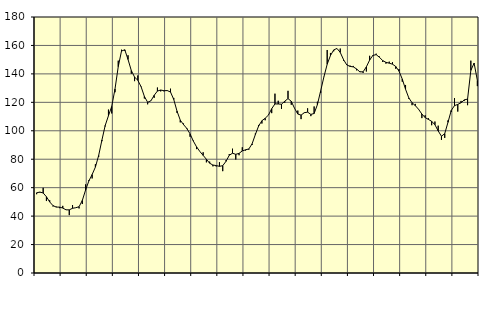
| Category | Piggar | Series 1 |
|---|---|---|
| nan | 55.4 | 56.39 |
| 87.0 | 56.6 | 56.91 |
| 87.0 | 59.9 | 56.26 |
| 87.0 | 50.6 | 53.62 |
| nan | 51.1 | 49.95 |
| 88.0 | 46.8 | 47.41 |
| 88.0 | 46.7 | 46.33 |
| 88.0 | 45.6 | 46.34 |
| nan | 47.2 | 45.67 |
| 89.0 | 44.5 | 44.42 |
| 89.0 | 40.7 | 44.4 |
| 89.0 | 47.8 | 45.5 |
| nan | 45.9 | 45.91 |
| 90.0 | 45.4 | 46.6 |
| 90.0 | 48.5 | 51.06 |
| 90.0 | 62.3 | 58.38 |
| nan | 65.3 | 64.73 |
| 91.0 | 66.5 | 69.23 |
| 91.0 | 76.5 | 74.47 |
| 91.0 | 81.6 | 82.65 |
| nan | 92.7 | 93.49 |
| 92.0 | 103.1 | 103.71 |
| 92.0 | 114.9 | 110.58 |
| 92.0 | 112.2 | 117.12 |
| nan | 127.1 | 129.34 |
| 93.0 | 149.3 | 145.12 |
| 93.0 | 157 | 156.05 |
| 93.0 | 156.2 | 156.95 |
| nan | 153.1 | 150.15 |
| 94.0 | 140.1 | 142.36 |
| 94.0 | 134.9 | 137.77 |
| 94.0 | 138.9 | 135.47 |
| nan | 131.2 | 130.95 |
| 95.0 | 122.7 | 124.18 |
| 95.0 | 118.6 | 120.04 |
| 95.0 | 121.2 | 121.05 |
| nan | 123.2 | 124.92 |
| 96.0 | 130.4 | 127.93 |
| 96.0 | 127.7 | 128.65 |
| 96.0 | 127.7 | 128.18 |
| nan | 128.5 | 128.27 |
| 97.0 | 129.6 | 127.27 |
| 97.0 | 123.1 | 122.01 |
| 97.0 | 112.6 | 113.82 |
| nan | 105.9 | 107.49 |
| 98.0 | 105.1 | 104.32 |
| 98.0 | 101.2 | 101.66 |
| 98.0 | 95.8 | 97.81 |
| nan | 93.1 | 92.74 |
| 99.0 | 87.1 | 88.65 |
| 99.0 | 85.4 | 85.44 |
| 99.0 | 84.9 | 82.71 |
| nan | 77.8 | 79.97 |
| 0.0 | 78.3 | 77.17 |
| 0.0 | 75 | 75.92 |
| 0.0 | 74.9 | 75.54 |
| nan | 77.9 | 75.01 |
| 1.0 | 71.6 | 75.46 |
| 1.0 | 79.3 | 78.49 |
| 1.0 | 83.6 | 82.79 |
| nan | 87.4 | 84.22 |
| 2.0 | 79.8 | 83.45 |
| 2.0 | 82.8 | 84.12 |
| 2.0 | 88.4 | 85.82 |
| nan | 86.1 | 86.63 |
| 3.0 | 86.7 | 87.21 |
| 3.0 | 90 | 90.83 |
| 3.0 | 98.1 | 97.35 |
| nan | 104.1 | 103.37 |
| 4.0 | 105.1 | 107.06 |
| 4.0 | 107.4 | 108.79 |
| 4.0 | 111.2 | 111.02 |
| nan | 112.4 | 115.52 |
| 5.0 | 126.1 | 118.89 |
| 5.0 | 121.1 | 118.83 |
| 5.0 | 115.4 | 118.69 |
| nan | 119.7 | 120.77 |
| 6.0 | 128.1 | 122.64 |
| 6.0 | 118.3 | 120.72 |
| 6.0 | 115.7 | 115.81 |
| nan | 114.2 | 111.76 |
| 7.0 | 108.2 | 111.02 |
| 7.0 | 112.5 | 112.71 |
| 7.0 | 115.8 | 113.11 |
| nan | 110.3 | 111.52 |
| 8.0 | 117.1 | 112.15 |
| 8.0 | 120.4 | 118.35 |
| 8.0 | 126.6 | 128.09 |
| nan | 137.8 | 137.94 |
| 9.0 | 156.8 | 146.8 |
| 9.0 | 154.7 | 152.89 |
| 9.0 | 155.9 | 156.86 |
| nan | 157.9 | 157.88 |
| 10.0 | 157.8 | 155.08 |
| 10.0 | 149.3 | 150.07 |
| 10.0 | 146.7 | 146.31 |
| nan | 145.8 | 145.27 |
| 11.0 | 145.6 | 144.92 |
| 11.0 | 142.5 | 143.49 |
| 11.0 | 141.9 | 141.43 |
| nan | 140.7 | 141.47 |
| 12.0 | 141.7 | 144.96 |
| 12.0 | 152.7 | 149.71 |
| 12.0 | 152.6 | 153.01 |
| nan | 154.2 | 153.52 |
| 13.0 | 152.2 | 151.69 |
| 13.0 | 148.4 | 149.34 |
| 13.0 | 147.2 | 148.12 |
| nan | 148.6 | 147.53 |
| 14.0 | 148.2 | 146.83 |
| 14.0 | 143.6 | 145.2 |
| 14.0 | 143.4 | 141.92 |
| nan | 134.5 | 136.36 |
| 15.0 | 132.2 | 129.21 |
| 15.0 | 122.5 | 123.13 |
| 15.0 | 118 | 119.7 |
| nan | 118.9 | 117.68 |
| 16.0 | 115.2 | 115.06 |
| 16.0 | 108.9 | 111.77 |
| 16.0 | 110.9 | 109.29 |
| nan | 108.8 | 107.99 |
| 17.0 | 103.9 | 106.67 |
| 17.0 | 106.5 | 104.24 |
| 17.0 | 103.6 | 99.88 |
| nan | 93.6 | 96.16 |
| 18.0 | 95 | 97.99 |
| 18.0 | 107.3 | 105.97 |
| 18.0 | 113.2 | 114.31 |
| nan | 123 | 117.69 |
| 19.0 | 113.5 | 118.56 |
| 19.0 | 121 | 119.7 |
| 19.0 | 121.1 | 121.73 |
| nan | 118 | 122.26 |
| 20.0 | 149.3 | 142.43 |
| 20.0 | 147.1 | 147.55 |
| 20.0 | 131.4 | 135.42 |